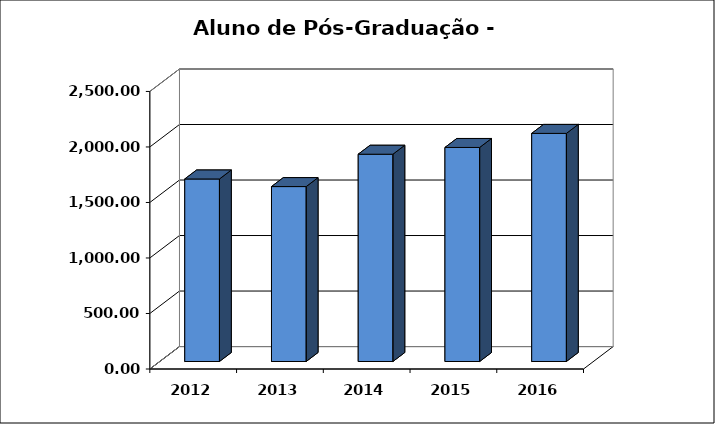
| Category | Series 0 |
|---|---|
| 2012.0 | 1644 |
| 2013.0 | 1575.5 |
| 2014.0 | 1867 |
| 2015.0 | 1927.917 |
| 2016.0 | 2054.49 |